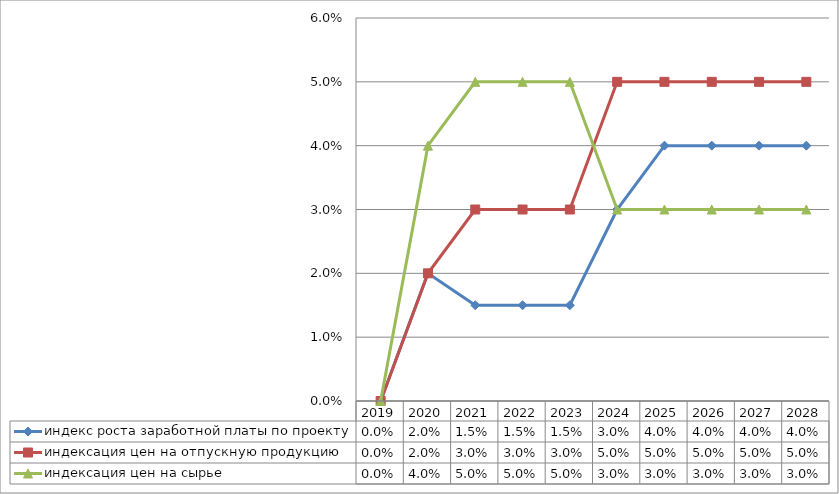
| Category | индекс роста заработной платы по проекту | индексация цен на отпускную продукцию | индексация цен на сырье  |
|---|---|---|---|
| 2019.0 | 0 | 0 | 0 |
| 2020.0 | 0.02 | 0.02 | 0.04 |
| 2021.0 | 0.015 | 0.03 | 0.05 |
| 2022.0 | 0.015 | 0.03 | 0.05 |
| 2023.0 | 0.015 | 0.03 | 0.05 |
| 2024.0 | 0.03 | 0.05 | 0.03 |
| 2025.0 | 0.04 | 0.05 | 0.03 |
| 2026.0 | 0.04 | 0.05 | 0.03 |
| 2027.0 | 0.04 | 0.05 | 0.03 |
| 2028.0 | 0.04 | 0.05 | 0.03 |